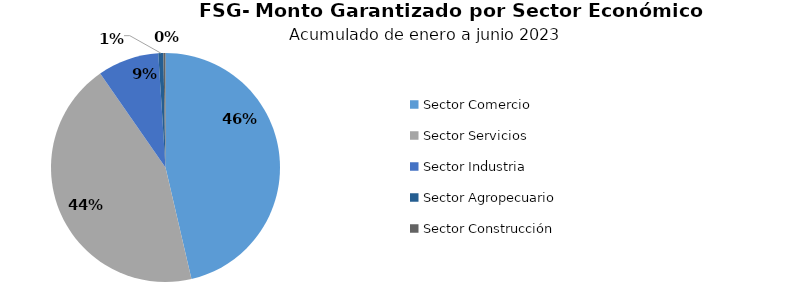
| Category | Monto | Créditos |
|---|---|---|
| Sector Comercio | 14.791 | 3298 |
| Sector Servicios | 14.032 | 1672 |
| Sector Industria | 2.762 | 770 |
| Sector Agropecuario | 0.226 | 15 |
| Sector Construcción | 0.095 | 13 |